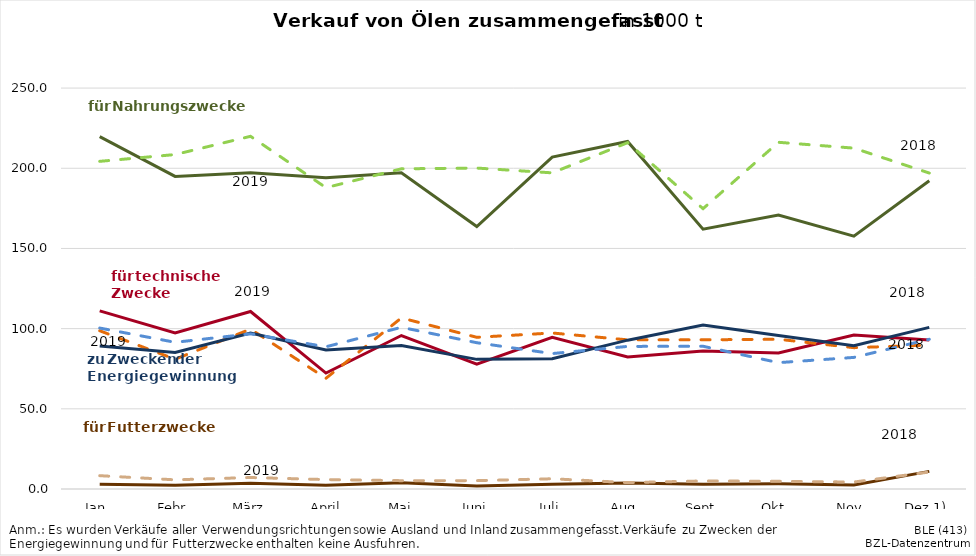
| Category | Series 0 | Series 1 | Series 2 | Series 3 | Series 4 | Series 5 | Series 6 | Series 7 |
|---|---|---|---|---|---|---|---|---|
| Jan. | 219.726 | 204.316 | 2.99 | 8.309 | 111.051 | 98.688 | 89.159 | 100.37 |
|  Febr. | 194.903 | 208.562 | 2.307 | 5.714 | 97.325 | 80.933 | 85.18 | 91.472 |
| März | 197.147 | 219.932 | 3.648 | 7.167 | 110.678 | 99.709 | 97.24 | 96.75 |
|  April | 194.021 | 187.908 | 2.308 | 5.864 | 72.293 | 69.038 | 86.679 | 88.678 |
|  Mai | 197.26 | 199.664 | 3.973 | 5.198 | 95.708 | 106.673 | 89.45 | 100.818 |
| Juni | 163.632 | 200.134 | 1.861 | 5.213 | 77.779 | 94.604 | 80.839 | 91.221 |
| Juli | 206.974 | 197.145 | 2.949 | 6.382 | 94.624 | 97.285 | 81.229 | 84.44 |
| Aug. | 216.75 | 215.966 | 3.686 | 3.994 | 82.329 | 93.006 | 92.816 | 88.921 |
|  Sept. | 162.032 | 174.809 | 3.003 | 5.022 | 86.047 | 93.027 | 102.275 | 89.009 |
| Okt. | 170.903 | 216.202 | 3.206 | 4.799 | 84.807 | 93.388 | 95.7 | 78.788 |
| Nov. | 157.666 | 212.561 | 2.435 | 4.339 | 96.081 | 88.132 | 89.307 | 82.059 |
| Dez 1) | 192.255 | 197.015 | 10.983 | 10.584 | 92.863 | 89.73 | 100.777 | 93.363 |